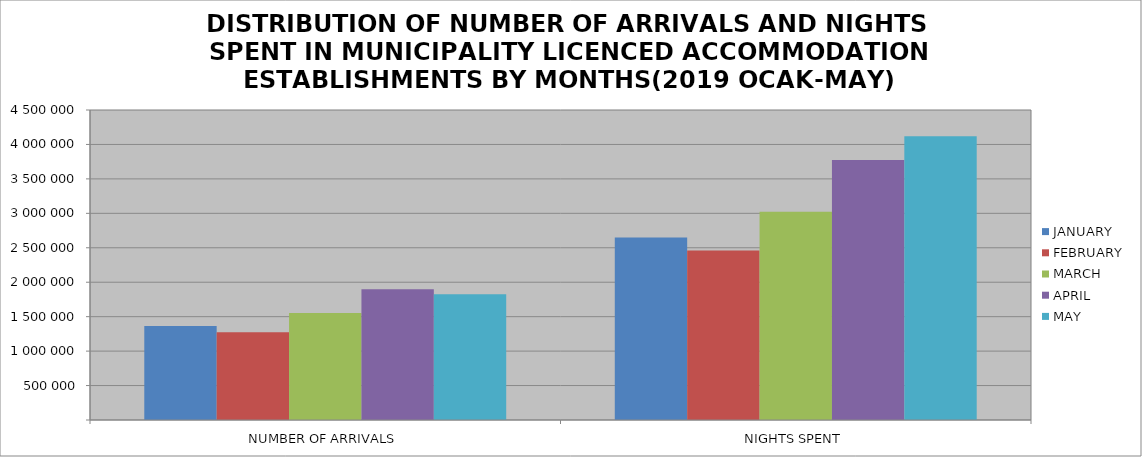
| Category | JANUARY | FEBRUARY | MARCH | APRIL | MAY |
|---|---|---|---|---|---|
| NUMBER OF ARRIVALS | 1363187 | 1273727 | 1552518 | 1898202 | 1826154 |
| NIGHTS SPENT | 2649437 | 2462023 | 3024704 | 3772615 | 4117532 |